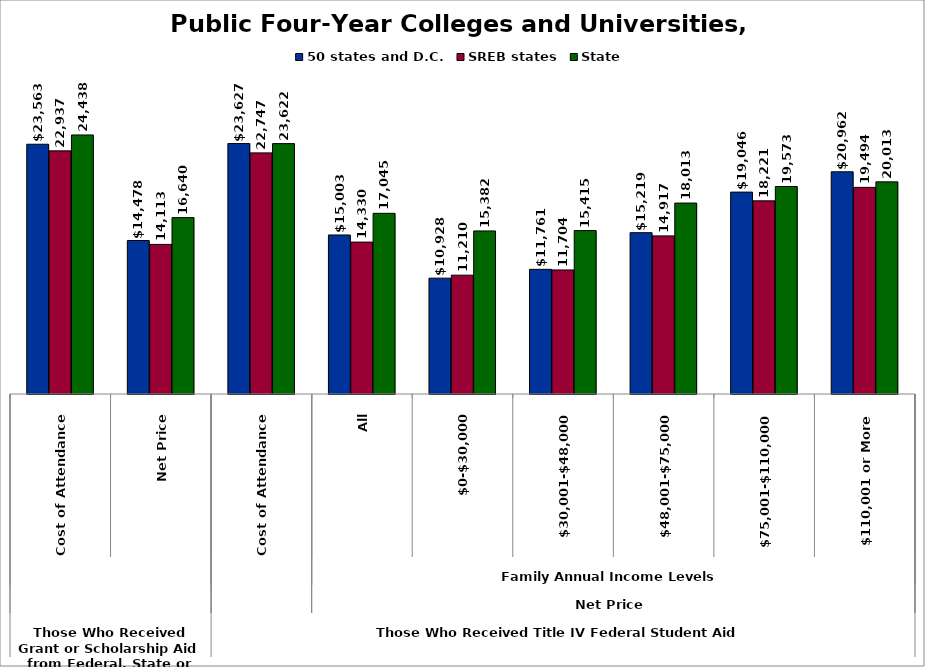
| Category | 50 states and D.C. | SREB states | State |
|---|---|---|---|
| 0 | 23562.7 | 22936.662 | 24437.779 |
| 1 | 14477.591 | 14112.923 | 16639.583 |
| 2 | 23626.73 | 22747.351 | 23621.724 |
| 3 | 15002.576 | 14329.618 | 17044.757 |
| 4 | 10928.475 | 11210.27 | 15381.921 |
| 5 | 11761.18 | 11703.656 | 15414.689 |
| 6 | 15218.702 | 14916.967 | 18012.884 |
| 7 | 19046.282 | 18221.369 | 19573.189 |
| 8 | 20961.555 | 19494.374 | 20012.724 |